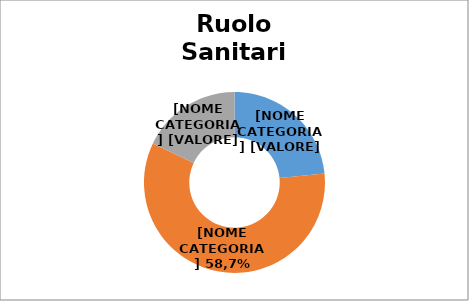
| Category | Series 0 |
|---|---|
| Medici e Odontoiatri | 0.234 |
| Infermieristico | 0.587 |
| Altro  | 0.179 |